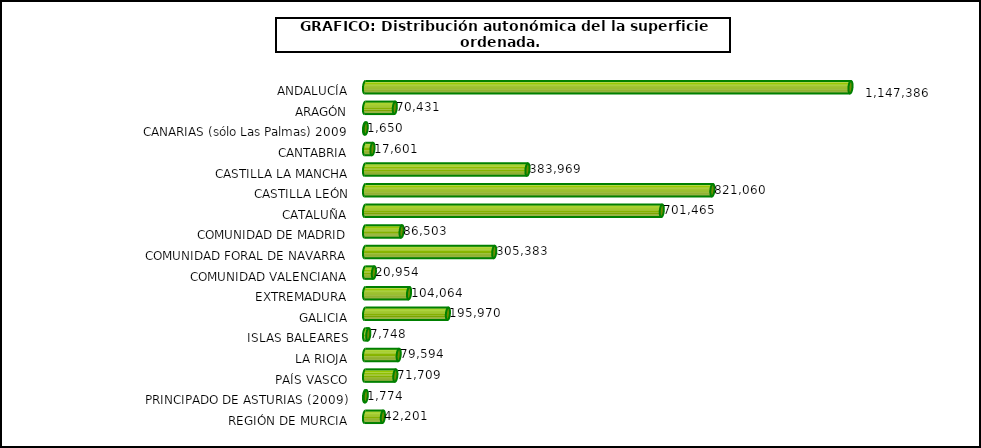
| Category | sup.ordenada |
|---|---|
| ANDALUCÍA | 1147385.814 |
| ARAGÓN | 70431.19 |
| CANARIAS (sólo Las Palmas) 2009 | 1650 |
| CANTABRIA | 17601 |
| CASTILLA LA MANCHA | 383969.36 |
| CASTILLA LEÓN | 821060.3 |
| CATALUÑA | 701465.2 |
| COMUNIDAD DE MADRID | 86503.4 |
| COMUNIDAD FORAL DE NAVARRA | 305382.58 |
| COMUNIDAD VALENCIANA | 20953.55 |
| EXTREMADURA | 104063.99 |
| GALICIA | 195970.28 |
| ISLAS BALEARES | 7747.81 |
| LA RIOJA | 79593.96 |
| PAÍS VASCO | 71709 |
| PRINCIPADO DE ASTURIAS (2009) | 1773.86 |
| REGIÓN DE MURCIA | 42200.62 |